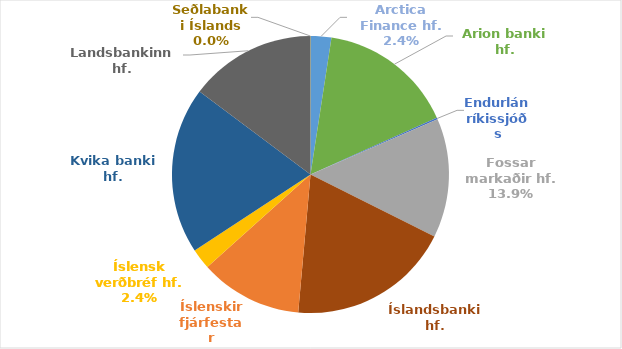
| Category | Total % |
|---|---|
| Arctica Finance hf. | 0.024 |
| Arion banki hf. | 0.158 |
| Endurlán ríkissjóðs | 0.002 |
| Fossar markaðir hf. | 0.139 |
| Íslandsbanki hf. | 0.19 |
| Íslenskir fjárfestar | 0.12 |
| Íslensk verðbréf hf. | 0.024 |
| Kvika banki hf. | 0.194 |
| Landsbankinn hf. | 0.148 |
| Seðlabanki Íslands | 0 |